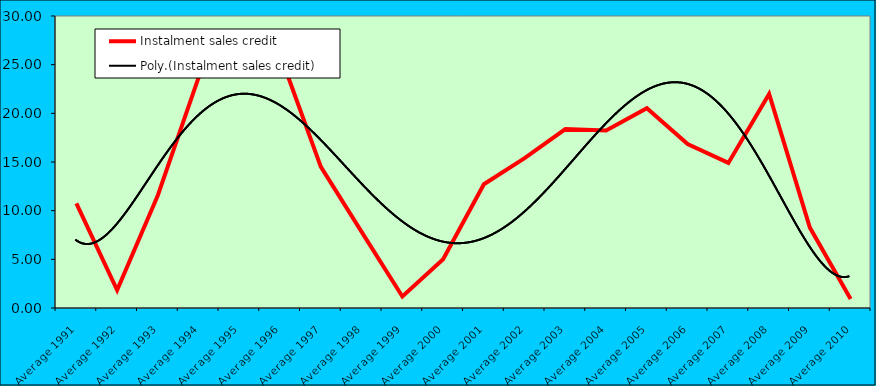
| Category | Instalment sales credit |
|---|---|
| Average 1991 | 10.755 |
| Average 1992 | 1.833 |
| Average 1993 | 11.59 |
| Average 1994 | 23.692 |
| Average 1995 | 27.178 |
| Average 1996 | 26.023 |
| Average 1997 | 14.501 |
| Average 1998 | 7.821 |
| Average 1999 | 1.181 |
| Average 2000 | 5.003 |
| Average 2001 | 12.717 |
| Average 2002 | 15.394 |
| Average 2003 | 18.388 |
| Average 2004 | 18.231 |
| Average 2005 | 20.519 |
| Average 2006 | 16.848 |
| Average 2007 | 14.907 |
| Average 2008 | 21.993 |
| Average 2009 | 8.259 |
| Average 2010 | 0.922 |